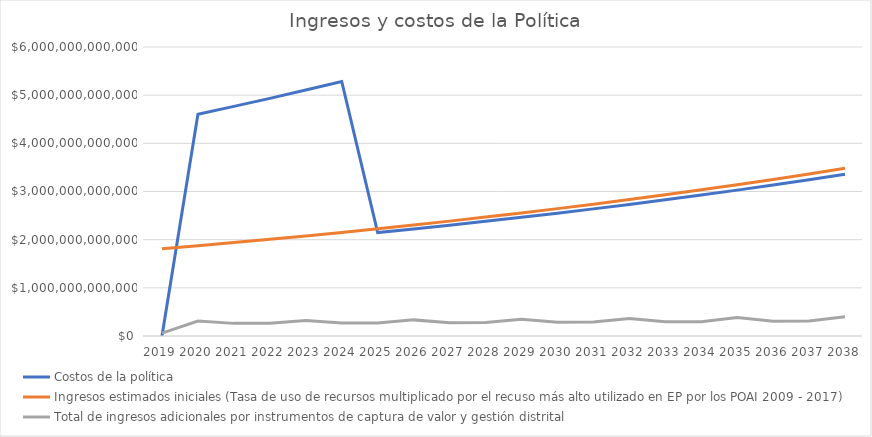
| Category | Costos de la política | Ingresos estimados iniciales (Tasa de uso de recursos multiplicado por el recuso más alto utilizado en EP por los POAI 2009 - 2017) | Total de ingresos adicionales por instrumentos de captura de valor y gestión distrital |
|---|---|---|---|
| 2019.0 | 267580133.333 | 1811192280943.064 | 59916510138.192 |
| 2020.0 | 4605597940425.612 | 1874584010776.071 | 309956471880.465 |
| 2021.0 | 4766793868340.51 | 1940194451153.233 | 262126947460.221 |
| 2022.0 | 4933631653732.432 | 2008101256943.596 | 264373389685.268 |
| 2023.0 | 5106308761613.062 | 2078384800936.622 | 321698457388.192 |
| 2024.0 | 5284882513701.9 | 2151128268969.403 | 269104902460.719 |
| 2025.0 | 2147084021906.278 | 2226417758383.332 | 271595573110.784 |
| 2026.0 | 2222231962672.998 | 2304342379926.749 | 334673417233.601 |
| 2027.0 | 2300010081366.552 | 2384994363224.185 | 276841485900.717 |
| 2028.0 | 2380510434214.38 | 2468469165937.031 | 279602936971.182 |
| 2029.0 | 2463828299411.882 | 2554865586744.827 | 349011038829.113 |
| 2030.0 | 2550062289891.3 | 2644285882280.896 | 285419174252.072 |
| 2031.0 | 2639314470037.494 | 2736835888160.727 | 288480844414.834 |
| 2032.0 | 2731690476488.805 | 2832625144246.352 | 364854673033.293 |
| 2033.0 | 2827299643165.916 | 2931767024294.974 | 294929410653.398 |
| 2034.0 | 2926255130676.722 | 3034378870145.298 | 298323939090.206 |
| 2035.0 | 3028674060250.407 | 3140582130600.384 | 382362776022.303 |
| 2036.0 | 3134677652359.168 | 3250502505171.397 | 305473579747.024 |
| 2037.0 | 3244391370191.74 | 3364270092852.396 | 309237154102.109 |
| 2038.0 | 3357945068148.451 | 3482019546102.229 | 401710503559.623 |